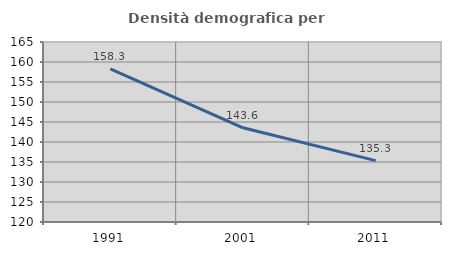
| Category | Densità demografica |
|---|---|
| 1991.0 | 158.27 |
| 2001.0 | 143.558 |
| 2011.0 | 135.334 |